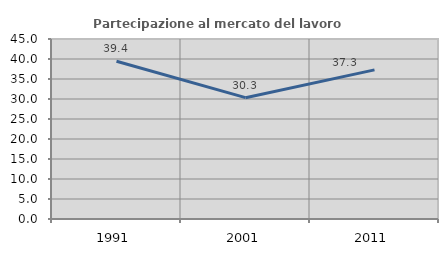
| Category | Partecipazione al mercato del lavoro  femminile |
|---|---|
| 1991.0 | 39.438 |
| 2001.0 | 30.332 |
| 2011.0 | 37.279 |